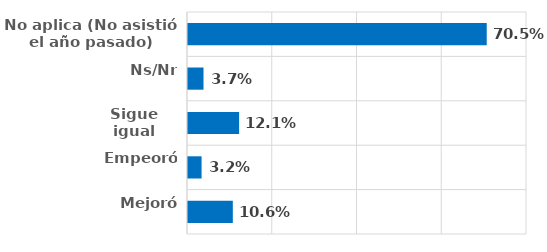
| Category | Series 0 |
|---|---|
| Mejoró | 0.106 |
| Empeoró | 0.032 |
| Sigue igual | 0.121 |
| Ns/Nr | 0.037 |
| No aplica (No asistió el año pasado) | 0.705 |